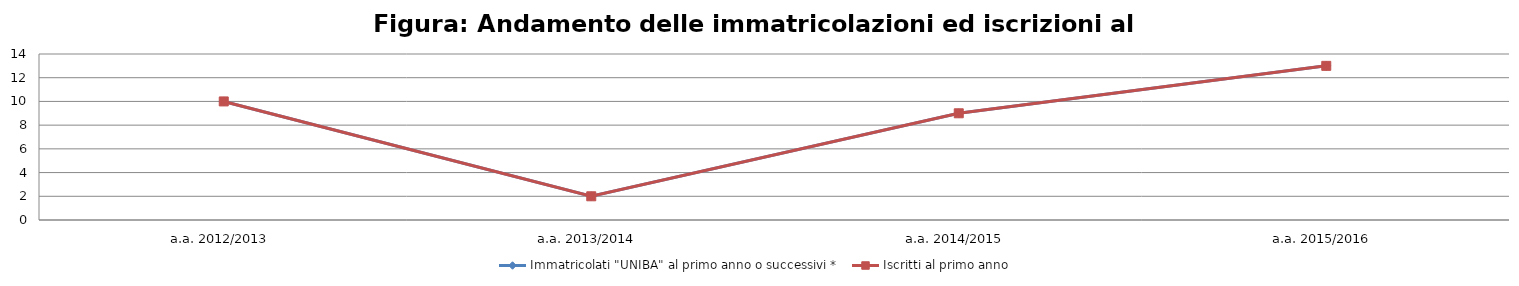
| Category | Immatricolati "UNIBA" al primo anno o successivi * | Iscritti al primo anno  |
|---|---|---|
| a.a. 2012/2013 | 10 | 10 |
| a.a. 2013/2014 | 2 | 2 |
| a.a. 2014/2015 | 9 | 9 |
| a.a. 2015/2016 | 13 | 13 |